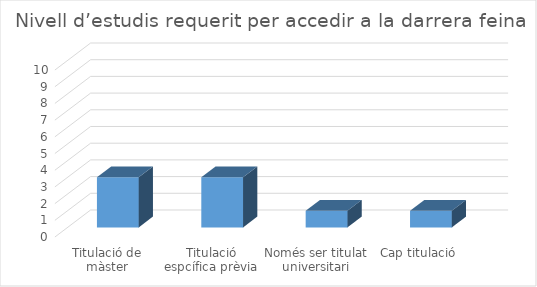
| Category | Series 0 |
|---|---|
| Titulació de màster | 3 |
| Titulació espcífica prèvia | 3 |
| Només ser titulat universitari | 1 |
| Cap titulació | 1 |